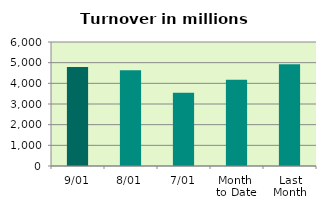
| Category | Series 0 |
|---|---|
| 9/01 | 4787.657 |
| 8/01 | 4629.314 |
| 7/01 | 3539.922 |
| Month 
to Date | 4167.377 |
| Last
Month | 4921.323 |